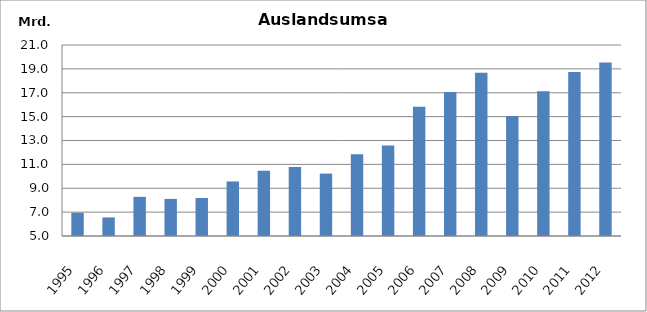
| Category | 1995 1996 1997 1998 1999 2000 2001 2002 2003 2004 2005 2006 2007 2008 2009 2010 2011 2012 |
|---|---|
| 1995 | 6943144 |
| 1996 | 6557769 |
| 1997 | 8280764 |
| 1998 | 8105464 |
| 1999 | 8182730 |
| 2000 | 9569050 |
| 2001 | 10464574 |
| 2002 | 10788499 |
| 2003 | 10230107 |
| 2004 | 11851867 |
| 2005 | 12574466 |
| 2006 | 15829050 |
| 2007 | 17072669 |
| 2008 | 18677331 |
| 2009 | 15048748 |
| 2010 | 17119030.883 |
| 2011 | 18748015 |
| 2012 | 19537292 |